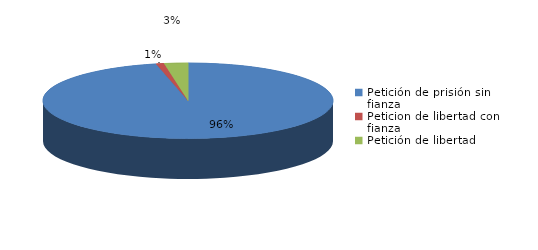
| Category | Series 0 |
|---|---|
| Petición de prisión sin fianza | 109 |
| Peticion de libertad con fianza | 1 |
| Petición de libertad | 3 |